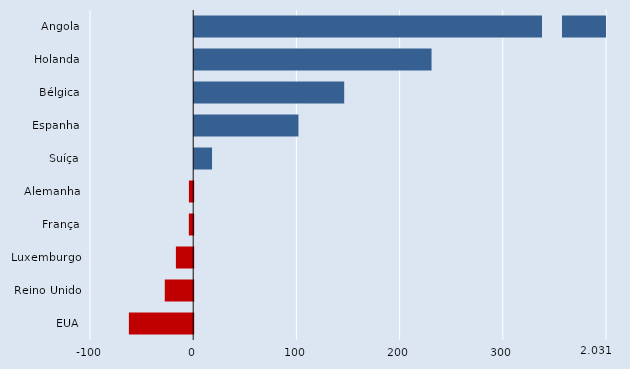
| Category | Series 0 |
|---|---|
| Angola | 2031.148 |
| Holanda | 229.981 |
| Bélgica | 145.345 |
| Espanha | 101.022 |
| Suíça | 17.292 |
| Alemanha | -4.158 |
| França | -4.232 |
| Luxemburgo | -16.774 |
| Reino Unido | -27.549 |
| EUA | -62.325 |